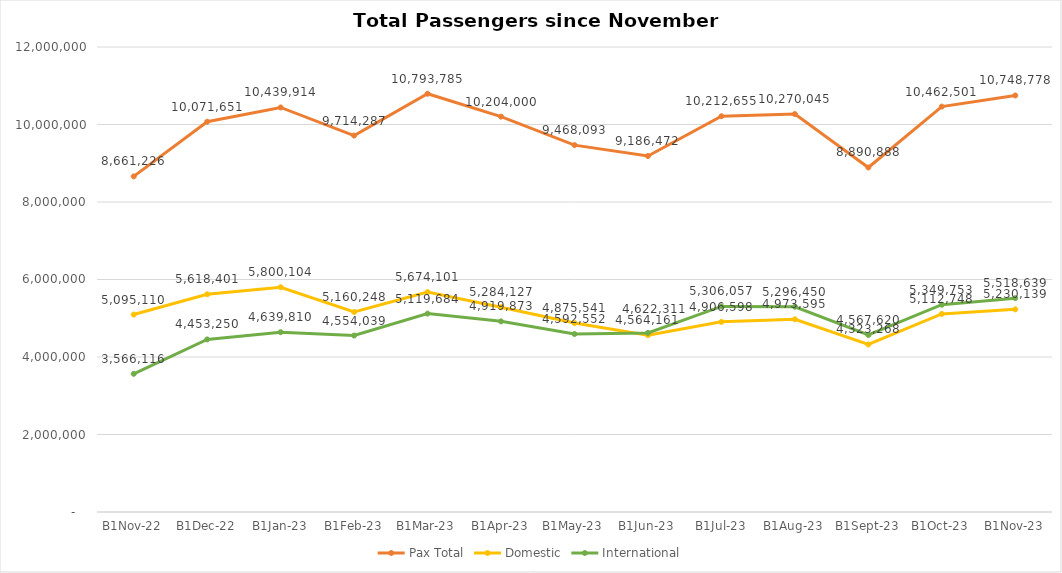
| Category | Pax Total | Domestic | International |
|---|---|---|---|
| 2022-11-01 | 8661226 | 5095110 | 3566116 |
| 2022-12-01 | 10071651 | 5618401 | 4453250 |
| 2023-01-01 | 10439914 | 5800104 | 4639810 |
| 2023-02-01 | 9714287 | 5160248 | 4554039 |
| 2023-03-01 | 10793785 | 5674101 | 5119684 |
| 2023-04-01 | 10204000 | 5284127 | 4919873 |
| 2023-05-01 | 9468093 | 4875541 | 4592552 |
| 2023-06-01 | 9186472 | 4564161 | 4622311 |
| 2023-07-01 | 10212655 | 4906598 | 5306057 |
| 2023-08-01 | 10270045 | 4973595 | 5296450 |
| 2023-09-01 | 8890888 | 4323268 | 4567620 |
| 2023-10-01 | 10462501 | 5112748 | 5349753 |
| 2023-11-01 | 10748778 | 5230139 | 5518639 |